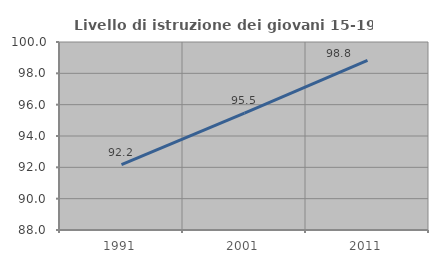
| Category | Livello di istruzione dei giovani 15-19 anni |
|---|---|
| 1991.0 | 92.174 |
| 2001.0 | 95.455 |
| 2011.0 | 98.824 |